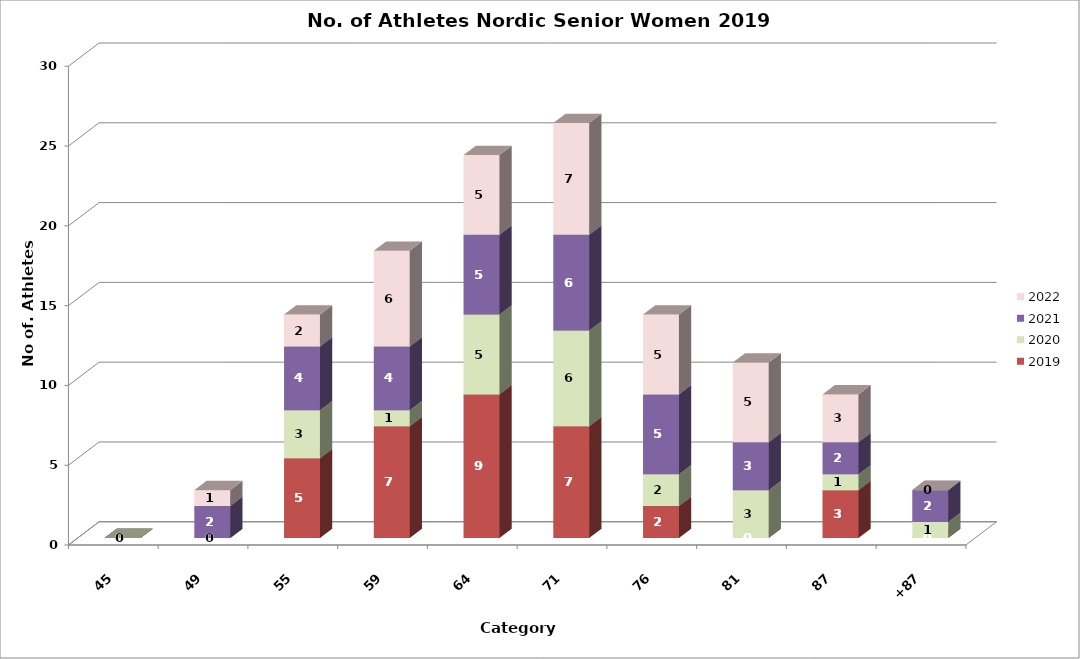
| Category | 2019 | 2020 | 2021 | 2022 |
|---|---|---|---|---|
| 45 | 0 | 0 | 0 | 0 |
| 49 | 0 | 0 | 2 | 1 |
| 55 | 5 | 3 | 4 | 2 |
| 59 | 7 | 1 | 4 | 6 |
| 64 | 9 | 5 | 5 | 5 |
| 71 | 7 | 6 | 6 | 7 |
| 76 | 2 | 2 | 5 | 5 |
| 81 | 0 | 3 | 3 | 5 |
| 87 | 3 | 1 | 2 | 3 |
| +87 | 0 | 1 | 2 | 0 |